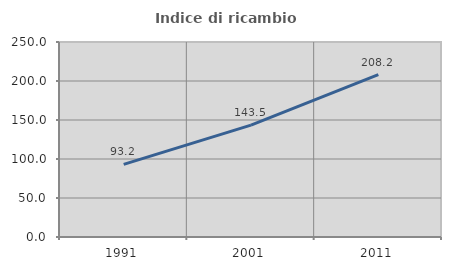
| Category | Indice di ricambio occupazionale  |
|---|---|
| 1991.0 | 93.151 |
| 2001.0 | 143.478 |
| 2011.0 | 208.197 |